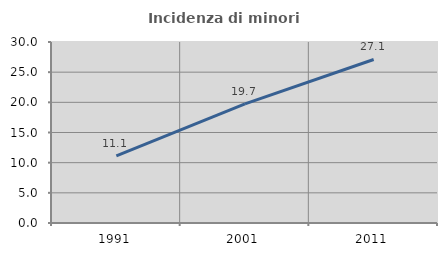
| Category | Incidenza di minori stranieri |
|---|---|
| 1991.0 | 11.111 |
| 2001.0 | 19.737 |
| 2011.0 | 27.105 |